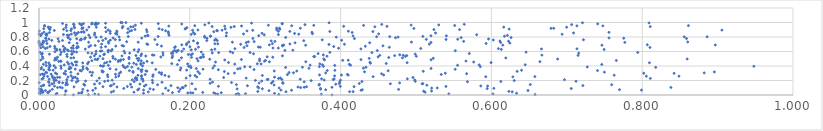
| Category | Series 0 |
|---|---|
| 0.3885912996649001 | 0.001 |
| 0.04568014979297941 | 0.002 |
| 0.034494299770958206 | 0.003 |
| 0.06544103512888798 | 0.004 |
| 0.2654786553118692 | 0.005 |
| 0.6579648299579562 | 0.006 |
| 0.07896282385531533 | 0.007 |
| 0.3179769616430818 | 0.008 |
| 0.2613465137476506 | 0.009 |
| 0.3744980564522131 | 0.01 |
| 0.2370850471365932 | 0.011 |
| 0.022426892672745988 | 0.012 |
| 0.07397478909600808 | 0.013 |
| 0.6021182190554446 | 0.014 |
| 0.1641297389679578 | 0.015 |
| 0.5435866994816935 | 0.016 |
| 0.2341700823863325 | 0.017 |
| 0.27392660834087784 | 0.018 |
| 0.2640816299803176 | 0.019 |
| 0.0017739346704785475 | 0.02 |
| 0.02380295528394952 | 0.021 |
| 0.3122676557970219 | 0.022 |
| 0.13861822031775123 | 0.023 |
| 0.6333729873995015 | 0.024 |
| 0.0002514098818220324 | 0.025 |
| 0.052695726150597866 | 0.026 |
| 0.05630732726060192 | 0.027 |
| 0.19728059959063893 | 0.028 |
| 0.20414104759435728 | 0.029 |
| 0.23182048442203132 | 0.03 |
| 0.20123793832932893 | 0.031 |
| 0.24171609205547587 | 0.032 |
| 0.17698890017039134 | 0.033 |
| 0.012401286446005893 | 0.034 |
| 0.011467405662844408 | 0.035 |
| 0.21714189083534088 | 0.036 |
| 0.005191027334300618 | 0.037 |
| 0.5120981437488354 | 0.038 |
| 0.1259212844313264 | 0.039 |
| 0.09592776339733157 | 0.04 |
| 0.004553401520262339 | 0.041 |
| 0.057130093241079975 | 0.042 |
| 0.14496115079754368 | 0.043 |
| 0.6276078443290874 | 0.044 |
| 0.3275439295590934 | 0.045 |
| 0.41193401992030243 | 0.046 |
| 0.4165989952111739 | 0.047 |
| 0.2901197960842463 | 0.048 |
| 0.18559715029072588 | 0.049 |
| 0.6232082741533077 | 0.05 |
| 0.0353302878521903 | 0.051 |
| 0.09897758554385287 | 0.052 |
| 0.5101873289756991 | 0.053 |
| 0.0014285474286228838 | 0.054 |
| 0.5206367913839332 | 0.055 |
| 0.014404664880159984 | 0.056 |
| 0.004470721066094161 | 0.057 |
| 0.035824480337756176 | 0.058 |
| 0.06453439004023294 | 0.059 |
| 0.305065778458635 | 0.06 |
| 0.008604183297960791 | 0.061 |
| 0.6484953722324461 | 0.062 |
| 0.1715167527006914 | 0.063 |
| 0.07140044032145243 | 0.064 |
| 0.42711439861369127 | 0.065 |
| 0.3349708619145034 | 0.066 |
| 0.3209150994576382 | 0.067 |
| 0.7990488298933376 | 0.068 |
| 0.13870761921371863 | 0.069 |
| 0.13088655079180997 | 0.07 |
| 0.0012999235088806457 | 0.071 |
| 0.38024221136581876 | 0.072 |
| 0.4288439172676947 | 0.073 |
| 0.7699230197191659 | 0.074 |
| 0.0033594454378548366 | 0.075 |
| 0.15178203651823524 | 0.076 |
| 0.4768700541448314 | 0.077 |
| 0.017672932487406805 | 0.078 |
| 0.058137333764332375 | 0.079 |
| 0.3734678123894995 | 0.08 |
| 0.2076077122303574 | 0.081 |
| 0.1875724265588125 | 0.082 |
| 0.0006078466786221371 | 0.083 |
| 0.2627962105567682 | 0.084 |
| 0.13248005451978598 | 0.085 |
| 0.29624278128302123 | 0.086 |
| 0.14722706974224384 | 0.087 |
| 0.5944648775980701 | 0.088 |
| 0.7059220301133016 | 0.089 |
| 0.3732981653292508 | 0.09 |
| 0.11235353247290375 | 0.091 |
| 0.6032580900063622 | 0.092 |
| 0.07495680498773724 | 0.093 |
| 0.16787806620469983 | 0.094 |
| 0.520783441267825 | 0.095 |
| 0.3185444847018437 | 0.096 |
| 0.528096072409565 | 0.097 |
| 0.030882452613538877 | 0.098 |
| 0.2914053303062836 | 0.099 |
| 0.19126918354652095 | 0.1 |
| 0.18402067043175047 | 0.101 |
| 0.34703929501113295 | 0.102 |
| 0.02465598954225511 | 0.103 |
| 0.8380661460960193 | 0.104 |
| 0.1902291067666029 | 0.105 |
| 0.38852711172241805 | 0.106 |
| 0.35182521541817624 | 0.107 |
| 0.028207487390081276 | 0.108 |
| 0.12291809901172476 | 0.109 |
| 0.34349013426027863 | 0.11 |
| 0.10342481818673027 | 0.111 |
| 0.04646018874759079 | 0.112 |
| 0.2899704383524175 | 0.113 |
| 0.35487905517082835 | 0.114 |
| 0.08479813964829824 | 0.115 |
| 0.41785448876608633 | 0.116 |
| 0.11721143696233362 | 0.117 |
| 0.5397137245003522 | 0.118 |
| 0.3996358777890627 | 0.119 |
| 0.2379516751961054 | 0.12 |
| 0.00308977626228721 | 0.121 |
| 0.02049600377338073 | 0.122 |
| 0.1396809860251757 | 0.123 |
| 0.5950203945916888 | 0.124 |
| 0.585942716578019 | 0.125 |
| 0.09470168564365282 | 0.126 |
| 0.19437093689266194 | 0.127 |
| 0.27643988549804843 | 0.128 |
| 0.17505142600982523 | 0.129 |
| 0.7213363098838795 | 0.13 |
| 0.09604123705407903 | 0.131 |
| 0.013820838332696627 | 0.132 |
| 0.005891867967952539 | 0.133 |
| 0.060560303335591266 | 0.134 |
| 0.5144248365494413 | 0.135 |
| 0.006374593408568158 | 0.136 |
| 0.3713650681234426 | 0.137 |
| 0.3117854168376703 | 0.138 |
| 0.14197911968380472 | 0.139 |
| 0.035545411544292645 | 0.14 |
| 0.15729721380635958 | 0.141 |
| 0.7595190600897942 | 0.142 |
| 0.26179520001773005 | 0.143 |
| 0.6515827194563134 | 0.144 |
| 0.03764780287692953 | 0.145 |
| 0.37190408073366826 | 0.146 |
| 0.12136594255863858 | 0.147 |
| 0.05944037081660208 | 0.148 |
| 0.39358120157165477 | 0.149 |
| 0.0736182755934044 | 0.15 |
| 0.1338064330034713 | 0.151 |
| 0.09921700710868962 | 0.152 |
| 0.016956075520488192 | 0.153 |
| 0.5080924835409575 | 0.154 |
| 0.46601100093755826 | 0.155 |
| 0.20286933436972943 | 0.156 |
| 0.5090202410279231 | 0.157 |
| 0.39824147414739597 | 0.158 |
| 0.42477980340689286 | 0.159 |
| 0.0805121218451937 | 0.16 |
| 0.3236380111163928 | 0.161 |
| 0.2270176087761528 | 0.162 |
| 0.019719929352465485 | 0.163 |
| 0.3082311261249649 | 0.164 |
| 0.2919192306856668 | 0.165 |
| 0.036050672014934934 | 0.166 |
| 0.47827103358063455 | 0.167 |
| 0.03142007696086621 | 0.168 |
| 0.00028191388817377526 | 0.169 |
| 0.1507608366884793 | 0.17 |
| 0.3232998310308184 | 0.171 |
| 0.2553352401378081 | 0.172 |
| 0.0265876233167394 | 0.173 |
| 0.013232400282367428 | 0.174 |
| 0.036697861553024166 | 0.175 |
| 0.16312645414156773 | 0.176 |
| 0.049574751698721 | 0.177 |
| 0.2302140192940377 | 0.178 |
| 0.02668153254664522 | 0.179 |
| 0.39894582883489305 | 0.18 |
| 0.3516559865881537 | 0.181 |
| 0.012740068007257641 | 0.182 |
| 0.568246596947958 | 0.183 |
| 0.1262459035508711 | 0.184 |
| 0.42833304108615516 | 0.185 |
| 0.3102997327899937 | 0.186 |
| 0.6125192869050767 | 0.187 |
| 0.08710498839041589 | 0.188 |
| 0.4990378330157604 | 0.189 |
| 0.7122505064040833 | 0.19 |
| 0.13804207992879483 | 0.191 |
| 0.2953765263873386 | 0.192 |
| 0.061789444526040904 | 0.193 |
| 0.07681258852855559 | 0.194 |
| 0.05177388638057489 | 0.195 |
| 0.09155852131965314 | 0.196 |
| 0.02052476989827676 | 0.197 |
| 0.360997141523083 | 0.198 |
| 0.6302849883997981 | 0.199 |
| 0.04363301822215 | 0.2 |
| 0.2870283869322517 | 0.201 |
| 0.02278985866011461 | 0.202 |
| 0.15035704689331597 | 0.203 |
| 0.09704116014347929 | 0.204 |
| 0.3998512359681855 | 0.205 |
| 0.37819548515209367 | 0.206 |
| 0.12963729565883234 | 0.207 |
| 0.49829902700020823 | 0.208 |
| 0.12374583365249965 | 0.209 |
| 0.02008043431412441 | 0.21 |
| 0.6969174031649984 | 0.211 |
| 0.0369600631662298 | 0.212 |
| 0.39018001947817127 | 0.213 |
| 0.3026653005085462 | 0.214 |
| 0.32214488325071927 | 0.215 |
| 0.3037720716064263 | 0.216 |
| 0.2269457350023957 | 0.217 |
| 0.34651533735007717 | 0.218 |
| 0.013489662404278914 | 0.219 |
| 0.13763171351399187 | 0.22 |
| 0.003907584485617166 | 0.221 |
| 0.39150489983918524 | 0.222 |
| 0.48852264103388926 | 0.223 |
| 0.374786110961824 | 0.224 |
| 0.13614588688669052 | 0.225 |
| 0.0508623704487016 | 0.226 |
| 0.12766129985164493 | 0.227 |
| 0.3176957149109014 | 0.228 |
| 0.8107910100490998 | 0.229 |
| 0.1295852172154426 | 0.23 |
| 0.0056753192156077225 | 0.231 |
| 0.07992492856046232 | 0.232 |
| 0.2747645012385094 | 0.233 |
| 0.195174522464103 | 0.234 |
| 0.32014496563452366 | 0.235 |
| 0.04463752139668267 | 0.236 |
| 0.018226161429361933 | 0.237 |
| 0.020989909601775793 | 0.238 |
| 0.0455464388368831 | 0.239 |
| 0.12817102728992638 | 0.24 |
| 0.2449057687375314 | 0.241 |
| 0.4959312859390136 | 0.242 |
| 0.024540046183103542 | 0.243 |
| 0.02746495974854569 | 0.244 |
| 0.048039951427388684 | 0.245 |
| 0.31235577138460274 | 0.246 |
| 0.10194257612933474 | 0.247 |
| 0.03846873777471701 | 0.248 |
| 0.20928086463048234 | 0.249 |
| 0.6284656254894138 | 0.25 |
| 0.0913131641335622 | 0.251 |
| 0.5924975778154639 | 0.252 |
| 0.4431268978691014 | 0.253 |
| 0.6576446554462669 | 0.254 |
| 0.17221250104258612 | 0.255 |
| 0.011393780079119654 | 0.256 |
| 0.13577117618054882 | 0.257 |
| 0.15086656701502776 | 0.258 |
| 0.8055079664046778 | 0.259 |
| 0.8487749090843818 | 0.26 |
| 0.01757323026442816 | 0.261 |
| 0.1057299930643401 | 0.262 |
| 0.006584077491047116 | 0.263 |
| 0.39202317547297655 | 0.264 |
| 0.04260503704641708 | 0.265 |
| 0.13608285744387583 | 0.266 |
| 0.2004113072685703 | 0.267 |
| 0.20688657305403957 | 0.268 |
| 0.29624637759529254 | 0.269 |
| 0.06988626952477985 | 0.27 |
| 0.16700690561201487 | 0.271 |
| 0.13118893005248186 | 0.272 |
| 0.7628031944075714 | 0.273 |
| 0.4100783531474689 | 0.274 |
| 0.4011439698851054 | 0.275 |
| 0.4571494244125698 | 0.276 |
| 0.3720671485604954 | 0.277 |
| 0.1514011675126413 | 0.278 |
| 0.09082214961860398 | 0.279 |
| 0.0015720967298583296 | 0.28 |
| 0.32946180837993344 | 0.281 |
| 0.14082973306280605 | 0.282 |
| 0.5335466242137192 | 0.283 |
| 0.4090032930693339 | 0.284 |
| 0.1624993455021091 | 0.285 |
| 0.10141694716566163 | 0.286 |
| 0.03514885405755301 | 0.287 |
| 0.015970866267764817 | 0.288 |
| 0.0044985529544451655 | 0.289 |
| 0.007117227686521675 | 0.29 |
| 0.023587554571029214 | 0.291 |
| 0.05162032037605449 | 0.292 |
| 0.4543978065525077 | 0.293 |
| 0.5671095659496487 | 0.294 |
| 0.2508614971978673 | 0.295 |
| 0.21296217974675777 | 0.296 |
| 0.10646406449087562 | 0.297 |
| 0.033052033297505494 | 0.298 |
| 0.8422964279729546 | 0.299 |
| 0.8020525991956174 | 0.3 |
| 0.5388814054509062 | 0.301 |
| 0.2592367683519 | 0.302 |
| 0.0216738328429713 | 0.303 |
| 0.38024413171806465 | 0.304 |
| 0.8822576148295285 | 0.305 |
| 0.16244219283494377 | 0.306 |
| 0.3375689715698566 | 0.307 |
| 0.01020960979553166 | 0.308 |
| 0.3316871897525667 | 0.309 |
| 0.15949209538066553 | 0.31 |
| 0.07107945186833563 | 0.311 |
| 0.1248585686324479 | 0.312 |
| 0.042224440907629654 | 0.313 |
| 0.009442095499924776 | 0.314 |
| 0.7498568702172727 | 0.315 |
| 0.10840845624625103 | 0.316 |
| 0.06763765874553339 | 0.317 |
| 0.8957407431811881 | 0.318 |
| 0.08380068208150757 | 0.319 |
| 0.4317455831665539 | 0.32 |
| 0.08524219846764675 | 0.321 |
| 0.1359459442498123 | 0.322 |
| 0.21074340215099735 | 0.323 |
| 0.24583147862770802 | 0.324 |
| 0.12459731860575618 | 0.325 |
| 0.6341693514737757 | 0.326 |
| 0.5096147812906316 | 0.327 |
| 0.14305003558410753 | 0.328 |
| 0.0352232958072641 | 0.329 |
| 0.3419173941414241 | 0.33 |
| 0.31204150090087246 | 0.331 |
| 0.05624094175732168 | 0.332 |
| 0.14185310693326614 | 0.333 |
| 0.46302218016301766 | 0.334 |
| 0.08362633765572254 | 0.335 |
| 0.11993169820773697 | 0.336 |
| 0.7407427116450136 | 0.337 |
| 0.38237957143544987 | 0.338 |
| 0.05448463952776728 | 0.339 |
| 0.39239871268989573 | 0.34 |
| 0.6400181531447775 | 0.341 |
| 0.01878306758363775 | 0.342 |
| 0.19580946853143963 | 0.343 |
| 0.1351358475862227 | 0.344 |
| 0.006422367615585898 | 0.345 |
| 0.18736254971635033 | 0.346 |
| 0.014084876165252745 | 0.347 |
| 0.1367581170899524 | 0.348 |
| 0.237941122347981 | 0.349 |
| 0.012914740885646862 | 0.35 |
| 0.28521171562701897 | 0.351 |
| 0.10229029789203503 | 0.352 |
| 0.1548255651005293 | 0.353 |
| 0.06449486721398422 | 0.354 |
| 0.5519514543250997 | 0.355 |
| 0.2175033133910074 | 0.356 |
| 0.04806964694480033 | 0.357 |
| 0.0026015233157297107 | 0.358 |
| 0.05842580419396207 | 0.359 |
| 0.26367019013928006 | 0.36 |
| 0.0407024596350441 | 0.361 |
| 0.03967015607757684 | 0.362 |
| 0.09416842037875034 | 0.363 |
| 0.13161968944797472 | 0.364 |
| 0.20860885941948626 | 0.365 |
| 0.5199775700548291 | 0.366 |
| 0.26671610192374795 | 0.367 |
| 0.029342978052359497 | 0.368 |
| 0.35804116437002703 | 0.369 |
| 0.43022459824482195 | 0.37 |
| 0.06328399910217022 | 0.371 |
| 0.2305855806718841 | 0.372 |
| 0.042417718315618524 | 0.373 |
| 0.18814132374554157 | 0.374 |
| 0.11458980870815903 | 0.375 |
| 0.021932869625320307 | 0.376 |
| 0.2016077194213552 | 0.377 |
| 0.003486793354893564 | 0.378 |
| 0.013335229731952399 | 0.379 |
| 0.3270552398913902 | 0.38 |
| 0.8178900254290823 | 0.381 |
| 0.43361707971990576 | 0.382 |
| 0.3493720656251905 | 0.383 |
| 0.12311486103286177 | 0.384 |
| 0.11261421485447037 | 0.385 |
| 0.040914575586492856 | 0.386 |
| 0.7271732453935685 | 0.387 |
| 0.2799964752605413 | 0.388 |
| 0.2727835630251524 | 0.389 |
| 0.05832137093897253 | 0.39 |
| 0.5853279101660013 | 0.391 |
| 0.3718904849575231 | 0.392 |
| 0.11747577380634014 | 0.393 |
| 0.3772033185338375 | 0.394 |
| 0.19842904746393591 | 0.395 |
| 0.9481048759106425 | 0.396 |
| 0.20074679840300685 | 0.397 |
| 0.08393615018036618 | 0.398 |
| 0.028964916769307476 | 0.399 |
| 0.08552771695585397 | 0.4 |
| 0.13727429029936233 | 0.401 |
| 0.23266850555521573 | 0.402 |
| 0.01473027313287642 | 0.403 |
| 0.08147651478111144 | 0.404 |
| 0.019924859588376365 | 0.405 |
| 0.009494203618886912 | 0.406 |
| 0.11125640035174314 | 0.407 |
| 0.3922450217457155 | 0.408 |
| 0.0919608493365012 | 0.409 |
| 0.5551666138956836 | 0.41 |
| 0.4131931364820714 | 0.411 |
| 0.3595721865635765 | 0.412 |
| 0.049527551042288134 | 0.413 |
| 0.04498291828352519 | 0.414 |
| 0.033451588204249316 | 0.415 |
| 0.5837472487193254 | 0.416 |
| 0.6447834176101817 | 0.417 |
| 0.3759728184585852 | 0.418 |
| 0.014201523486452688 | 0.419 |
| 0.18357915468284436 | 0.42 |
| 0.7463738807948967 | 0.421 |
| 0.1290653816136783 | 0.422 |
| 0.41158597722600343 | 0.423 |
| 0.005779513357900551 | 0.424 |
| 0.13495873062394062 | 0.425 |
| 0.2595942801356165 | 0.426 |
| 0.039256359189882926 | 0.427 |
| 0.29453165626643035 | 0.428 |
| 0.19711411075579494 | 0.429 |
| 0.37252732818612344 | 0.43 |
| 0.2895420590727385 | 0.431 |
| 0.06444246579140496 | 0.432 |
| 0.17610341557820505 | 0.433 |
| 0.13520493183631135 | 0.434 |
| 0.460520304296559 | 0.435 |
| 0.11968847104405499 | 0.436 |
| 0.43960112049682915 | 0.437 |
| 0.043303807647355884 | 0.438 |
| 0.12566355477499644 | 0.439 |
| 0.0870142595594529 | 0.44 |
| 0.13875469060334492 | 0.441 |
| 0.01296089778299604 | 0.442 |
| 0.058023127191111086 | 0.443 |
| 0.15015924615685874 | 0.444 |
| 0.8095879380036638 | 0.445 |
| 0.48825552086885926 | 0.446 |
| 0.599550885111572 | 0.447 |
| 0.25138228963772535 | 0.448 |
| 0.009112753191045472 | 0.449 |
| 0.08978480752691868 | 0.45 |
| 0.03772517974096289 | 0.451 |
| 0.4389113534935962 | 0.452 |
| 0.06569578404681879 | 0.453 |
| 0.2340750522577499 | 0.454 |
| 0.5765118595362151 | 0.455 |
| 0.05037543133996635 | 0.456 |
| 0.048227371432360645 | 0.457 |
| 0.3055638619422562 | 0.458 |
| 0.35384187563365405 | 0.459 |
| 0.6643062773883999 | 0.46 |
| 0.09403824756038703 | 0.461 |
| 0.10516752085346302 | 0.462 |
| 0.02621001135285664 | 0.463 |
| 0.14331673829960276 | 0.464 |
| 0.028733991841729162 | 0.465 |
| 0.2990401426954556 | 0.466 |
| 0.029135384241578768 | 0.467 |
| 0.5662303357521106 | 0.468 |
| 0.10778240675875117 | 0.469 |
| 0.2109713625239329 | 0.47 |
| 0.29252945847163947 | 0.471 |
| 0.1355145435040712 | 0.472 |
| 0.07009802026840245 | 0.473 |
| 0.13181859663351203 | 0.474 |
| 0.10541314652982578 | 0.475 |
| 0.7657096197194447 | 0.476 |
| 0.30044071227478736 | 0.477 |
| 0.40283595998986194 | 0.478 |
| 0.18587490342101298 | 0.479 |
| 0.4100717948611326 | 0.48 |
| 0.020804762733771003 | 0.481 |
| 0.0022989487506168546 | 0.482 |
| 0.24637387364645888 | 0.483 |
| 0.37859627577052957 | 0.484 |
| 0.10839681947221562 | 0.485 |
| 0.5200406839354654 | 0.486 |
| 0.0771903556444767 | 0.487 |
| 0.4270596111980621 | 0.488 |
| 0.2684881849784473 | 0.489 |
| 0.11193046640662158 | 0.49 |
| 0.023440783407494403 | 0.491 |
| 0.07447010040655863 | 0.492 |
| 0.2264059154915284 | 0.493 |
| 0.10131366176197613 | 0.494 |
| 0.29254110891311125 | 0.495 |
| 0.6878354588549372 | 0.496 |
| 0.8596649290177997 | 0.497 |
| 0.37771137397336585 | 0.498 |
| 0.07826276840821948 | 0.499 |
| 0.11936878339891904 | 0.5 |
| 0.08481693446491304 | 0.501 |
| 0.20946424676610292 | 0.502 |
| 0.13239124715535588 | 0.503 |
| 0.13028388195953078 | 0.504 |
| 0.4379925959411104 | 0.505 |
| 0.0051220912252720255 | 0.506 |
| 0.5229311395780788 | 0.507 |
| 0.021575930634258212 | 0.508 |
| 0.09821920950195485 | 0.509 |
| 0.04238055298214177 | 0.51 |
| 0.6191102534837316 | 0.511 |
| 0.4819821288821126 | 0.512 |
| 0.1889573842884714 | 0.513 |
| 0.045981360457881267 | 0.514 |
| 0.17651049080353 | 0.515 |
| 0.21387678160190887 | 0.516 |
| 0.4639016885704844 | 0.517 |
| 0.21520766034354336 | 0.518 |
| 0.20231059801481324 | 0.519 |
| 0.1194178440137192 | 0.52 |
| 0.31005638447489076 | 0.521 |
| 0.06836670738995652 | 0.522 |
| 0.02455014420385129 | 0.523 |
| 0.1615916971536765 | 0.524 |
| 0.21814976951151796 | 0.525 |
| 0.4497597726969386 | 0.526 |
| 0.30266076902963285 | 0.527 |
| 0.004538049314919775 | 0.528 |
| 0.03738924252603319 | 0.529 |
| 0.3643135155916345 | 0.53 |
| 0.36558787521314146 | 0.531 |
| 0.09787548173058339 | 0.532 |
| 0.48596473639701715 | 0.533 |
| 0.500381378665156 | 0.534 |
| 0.38189143225881594 | 0.535 |
| 0.08092470498583641 | 0.536 |
| 0.17718586812987328 | 0.537 |
| 0.14155769761035128 | 0.538 |
| 0.11008161587763085 | 0.539 |
| 0.322926495332179 | 0.54 |
| 0.07344484299631501 | 0.541 |
| 0.13517616164744972 | 0.542 |
| 0.4716623157488677 | 0.543 |
| 0.48771928194837894 | 0.544 |
| 0.12856982032959066 | 0.545 |
| 0.7149865140211222 | 0.546 |
| 0.45192897995996567 | 0.547 |
| 0.48304123388472053 | 0.548 |
| 0.15254756247648205 | 0.549 |
| 0.6669699348741115 | 0.55 |
| 0.16452075096172636 | 0.551 |
| 0.15036477453362587 | 0.552 |
| 0.37706429795846014 | 0.553 |
| 0.20168118409830907 | 0.554 |
| 0.47846201123335225 | 0.555 |
| 0.2176530333146807 | 0.556 |
| 0.08595677680933056 | 0.557 |
| 0.02841364307822414 | 0.558 |
| 0.19807896269022798 | 0.559 |
| 0.0370469676141052 | 0.56 |
| 0.04331251408329776 | 0.561 |
| 0.003345629379852088 | 0.562 |
| 0.01390978505446986 | 0.563 |
| 0.4989712885556425 | 0.564 |
| 0.08676304282177556 | 0.565 |
| 0.13611297958966057 | 0.566 |
| 0.2034430000445708 | 0.567 |
| 0.28447123135581365 | 0.568 |
| 0.07534363286513182 | 0.569 |
| 0.044079711374354555 | 0.57 |
| 0.37014246253615907 | 0.571 |
| 0.5707248675583312 | 0.572 |
| 0.0045004996063331805 | 0.573 |
| 0.17736036018605558 | 0.574 |
| 0.1755485775167412 | 0.575 |
| 0.07009207975769995 | 0.576 |
| 0.12021619820223718 | 0.577 |
| 0.7158909763055676 | 0.578 |
| 0.11388142055392572 | 0.579 |
| 0.2298148103918396 | 0.58 |
| 0.06499235124580781 | 0.581 |
| 0.2569665663386745 | 0.582 |
| 0.1643548892561834 | 0.583 |
| 0.23830616289461098 | 0.584 |
| 0.4415236108446895 | 0.585 |
| 0.2799331073253092 | 0.586 |
| 0.7940849041496809 | 0.587 |
| 0.38580701451591604 | 0.588 |
| 0.0012555411009192174 | 0.589 |
| 0.029433258612035117 | 0.59 |
| 0.6459617196994217 | 0.591 |
| 0.049878123245416746 | 0.592 |
| 0.21529793520390364 | 0.593 |
| 0.0917887885100757 | 0.594 |
| 0.182414032201401 | 0.595 |
| 0.13121465807260882 | 0.596 |
| 0.021198148380765416 | 0.597 |
| 0.2536581584538812 | 0.598 |
| 0.046319977631126164 | 0.599 |
| 0.1779760447424858 | 0.6 |
| 0.03342178929263945 | 0.601 |
| 0.18945849242396126 | 0.602 |
| 0.07578328603584944 | 0.603 |
| 0.043121559581397566 | 0.604 |
| 0.11270613196680833 | 0.605 |
| 0.08146253514384957 | 0.606 |
| 0.08349035862339366 | 0.607 |
| 0.18286640504148297 | 0.608 |
| 0.09583207853827741 | 0.609 |
| 0.03906800323496387 | 0.61 |
| 0.5521172706629827 | 0.611 |
| 0.0915804133906852 | 0.612 |
| 0.4486397785889366 | 0.613 |
| 0.17980116780005656 | 0.614 |
| 0.3261445019643273 | 0.615 |
| 0.18468120107420102 | 0.616 |
| 0.09219904759971861 | 0.617 |
| 0.33666844932915035 | 0.618 |
| 0.03298172222708021 | 0.619 |
| 0.023594387549979022 | 0.62 |
| 0.037804561307806794 | 0.621 |
| 0.2288833841484382 | 0.622 |
| 0.20191630004794794 | 0.623 |
| 0.12635372713840945 | 0.624 |
| 0.027751761147106674 | 0.625 |
| 0.13242476729909486 | 0.626 |
| 0.09704656507416184 | 0.627 |
| 0.7495355842004544 | 0.628 |
| 0.613237570154329 | 0.629 |
| 0.20761047079682923 | 0.63 |
| 0.023338616543740583 | 0.631 |
| 0.23324654417763588 | 0.632 |
| 0.06138969370838313 | 0.633 |
| 0.19197351344378905 | 0.634 |
| 0.6663864480332331 | 0.635 |
| 0.426910015141613 | 0.636 |
| 0.7134954596984838 | 0.637 |
| 0.03410744382553303 | 0.638 |
| 0.2597920121143072 | 0.639 |
| 0.6092945562654781 | 0.64 |
| 0.008480049936208883 | 0.641 |
| 0.5062744607707753 | 0.642 |
| 0.045285274765532645 | 0.643 |
| 0.02115555021353207 | 0.644 |
| 0.3973213113126393 | 0.645 |
| 0.03453448053156674 | 0.646 |
| 0.31737204141019687 | 0.647 |
| 0.310347289205983 | 0.648 |
| 0.050042725400108554 | 0.649 |
| 0.043015602641803194 | 0.65 |
| 0.010900519518858438 | 0.651 |
| 0.00235437923351028 | 0.652 |
| 0.17979819748114345 | 0.653 |
| 0.05041138892738015 | 0.654 |
| 0.27202323912849724 | 0.655 |
| 0.810297614760865 | 0.656 |
| 0.08238165851528809 | 0.657 |
| 0.4646491367385085 | 0.658 |
| 0.29347541778467157 | 0.659 |
| 0.21148250021262024 | 0.66 |
| 0.05205425985272268 | 0.661 |
| 0.2909589866404979 | 0.662 |
| 0.005695235623411506 | 0.663 |
| 0.06617939115077572 | 0.664 |
| 0.20019275522687244 | 0.665 |
| 0.18083443204625926 | 0.666 |
| 0.08828711182445519 | 0.667 |
| 0.3909124887862879 | 0.668 |
| 0.05107028429037609 | 0.669 |
| 0.014534868018224793 | 0.67 |
| 0.020752464499415937 | 0.671 |
| 0.43284565238959843 | 0.672 |
| 0.032057622970495296 | 0.673 |
| 0.10182725343558177 | 0.674 |
| 0.16239855274863005 | 0.675 |
| 0.11205474751007982 | 0.676 |
| 0.32292721280466136 | 0.677 |
| 0.45620638242901573 | 0.678 |
| 0.27584944158394276 | 0.679 |
| 0.04550527635819238 | 0.68 |
| 0.11020512497750559 | 0.681 |
| 0.06853511507256842 | 0.682 |
| 0.0745098310776339 | 0.683 |
| 0.0006530020471492204 | 0.684 |
| 0.3230106882853846 | 0.685 |
| 0.35363919062059584 | 0.686 |
| 0.7465831604498189 | 0.687 |
| 0.6150734370090561 | 0.688 |
| 0.32467026138458843 | 0.689 |
| 0.8969196674942176 | 0.69 |
| 0.30552775139445504 | 0.691 |
| 0.18940111422552913 | 0.692 |
| 0.8068336355959342 | 0.693 |
| 0.1955849374209544 | 0.694 |
| 0.0036313115102657952 | 0.695 |
| 0.15683747100043174 | 0.696 |
| 0.3845467584452786 | 0.697 |
| 0.14421032964243694 | 0.698 |
| 0.2674949520868335 | 0.699 |
| 0.40504984429481006 | 0.7 |
| 0.5176434775106658 | 0.701 |
| 0.08304106700157791 | 0.702 |
| 0.0038306252514591823 | 0.703 |
| 0.3327667636733574 | 0.704 |
| 0.1429929414876548 | 0.705 |
| 0.23718814328717283 | 0.706 |
| 0.23326348576229086 | 0.707 |
| 0.3095433275190253 | 0.708 |
| 0.19590247413892448 | 0.709 |
| 0.010587631211297134 | 0.71 |
| 0.5929959714972954 | 0.711 |
| 0.2101925108491979 | 0.712 |
| 0.0003414227438518891 | 0.713 |
| 0.0505179780065083 | 0.714 |
| 0.09240865914812543 | 0.715 |
| 0.6244970355107214 | 0.716 |
| 0.005353802457054765 | 0.717 |
| 0.21055720944670975 | 0.718 |
| 8.374840601944557e-05 | 0.719 |
| 0.3395917422401335 | 0.72 |
| 0.43854722267518803 | 0.721 |
| 0.04011275411256677 | 0.722 |
| 0.2748628266089156 | 0.723 |
| 0.6122412748382432 | 0.724 |
| 0.5198539651175794 | 0.725 |
| 0.7769451172296872 | 0.726 |
| 0.06584996285570599 | 0.727 |
| 0.13156974542421707 | 0.728 |
| 0.25652778449918456 | 0.729 |
| 0.4939485609831108 | 0.73 |
| 0.1985794682966306 | 0.731 |
| 0.8603387309716838 | 0.732 |
| 0.27768635306638717 | 0.733 |
| 0.006348584687715956 | 0.734 |
| 0.11631148372167747 | 0.735 |
| 0.09204635548514992 | 0.736 |
| 0.2853049332427844 | 0.737 |
| 0.026362727591249663 | 0.738 |
| 0.31289524280919556 | 0.739 |
| 0.563174008441367 | 0.74 |
| 4.3276539488525187e-05 | 0.741 |
| 0.6227358058110365 | 0.742 |
| 0.07891248508977755 | 0.743 |
| 0.005576327319239412 | 0.744 |
| 0.6112904765960501 | 0.745 |
| 0.30796304848593853 | 0.746 |
| 0.20484205977777292 | 0.747 |
| 0.00976626516476696 | 0.748 |
| 0.35117976498834025 | 0.749 |
| 0.22252311202736608 | 0.75 |
| 0.236485890355176 | 0.751 |
| 0.031154425547004 | 0.752 |
| 0.08461844212514162 | 0.753 |
| 0.016911917642435815 | 0.754 |
| 0.40140772135296177 | 0.755 |
| 0.23296520215865837 | 0.756 |
| 0.0946475047593216 | 0.757 |
| 0.05448146853635076 | 0.758 |
| 0.6025295881357926 | 0.759 |
| 0.10699328043041675 | 0.76 |
| 0.37560452738530037 | 0.761 |
| 0.7220986048962225 | 0.762 |
| 0.056151084583069784 | 0.763 |
| 0.10117958204421967 | 0.764 |
| 0.15367372316923278 | 0.765 |
| 0.539837543756785 | 0.766 |
| 0.5136503354974921 | 0.767 |
| 0.04153190695836177 | 0.768 |
| 0.5553232902624885 | 0.769 |
| 0.23448283043645576 | 0.77 |
| 0.013196454734441136 | 0.771 |
| 0.055970378463201166 | 0.772 |
| 0.5962269525506357 | 0.773 |
| 0.06042103844020448 | 0.774 |
| 0.02527886319221811 | 0.775 |
| 0.04996823317216191 | 0.776 |
| 0.08845944965857541 | 0.777 |
| 0.41834147625716267 | 0.778 |
| 0.858769309094504 | 0.779 |
| 0.2836710712964586 | 0.78 |
| 0.00905144783551677 | 0.781 |
| 0.22282534288403782 | 0.782 |
| 0.775494689799456 | 0.783 |
| 0.008983174148422842 | 0.784 |
| 0.13625419735487893 | 0.785 |
| 0.0982494760791609 | 0.786 |
| 0.755950559883346 | 0.787 |
| 0.03860104958030734 | 0.788 |
| 0.06147019839897692 | 0.789 |
| 0.4729274417334741 | 0.79 |
| 0.5599140243394738 | 0.791 |
| 0.06768604326230272 | 0.792 |
| 0.6260507256094153 | 0.793 |
| 0.3271903207710858 | 0.794 |
| 0.038743725070645024 | 0.795 |
| 0.07571121626667114 | 0.796 |
| 0.21984466660345756 | 0.797 |
| 0.3942544018884787 | 0.798 |
| 0.47625571304474684 | 0.799 |
| 0.08244064852378553 | 0.8 |
| 0.10626816812919243 | 0.801 |
| 0.8557678627331482 | 0.802 |
| 0.8860834231832683 | 0.803 |
| 0.44780292344583045 | 0.804 |
| 0.46517738681753884 | 0.805 |
| 0.11837462773387826 | 0.806 |
| 0.15807898214455496 | 0.807 |
| 0.5091133926951646 | 0.808 |
| 0.22731255124403346 | 0.809 |
| 0.21963546357855038 | 0.81 |
| 0.6173269993728495 | 0.811 |
| 0.14072990131684 | 0.812 |
| 0.2276566922286564 | 0.813 |
| 0.24828746532500195 | 0.814 |
| 0.4165116907297917 | 0.815 |
| 0.5403366537864268 | 0.816 |
| 0.5198231654887022 | 0.817 |
| 0.29140042169177893 | 0.818 |
| 0.14458771631621953 | 0.819 |
| 0.0023104075787062006 | 0.82 |
| 0.14376749357844723 | 0.821 |
| 0.6212997973837727 | 0.822 |
| 0.010306047484776388 | 0.823 |
| 0.17243493536093216 | 0.824 |
| 0.03741929771491683 | 0.825 |
| 0.06601533987283807 | 0.826 |
| 0.03987256564883735 | 0.827 |
| 0.048615884533932854 | 0.828 |
| 0.07365541338544068 | 0.829 |
| 0.29878454654910075 | 0.83 |
| 0.000748981921400232 | 0.831 |
| 0.5804542072471918 | 0.832 |
| 0.3174959251590536 | 0.833 |
| 0.03244302628098091 | 0.834 |
| 0.008912773003791652 | 0.835 |
| 0.2019362913898463 | 0.836 |
| 0.10338102095808503 | 0.837 |
| 0.6937899482843783 | 0.838 |
| 0.3445783736945512 | 0.839 |
| 0.04297681345642036 | 0.84 |
| 0.20666947565783858 | 0.841 |
| 0.27127161687891327 | 0.842 |
| 0.45048295313735975 | 0.843 |
| 0.01058915692949337 | 0.844 |
| 0.00027149157744222707 | 0.845 |
| 0.36268829664334545 | 0.846 |
| 0.0040874150297501655 | 0.847 |
| 0.10150841482357101 | 0.848 |
| 0.338986836923897 | 0.849 |
| 0.09448399763811721 | 0.85 |
| 0.2958167586069914 | 0.851 |
| 0.05074662202013597 | 0.852 |
| 0.17169810736022015 | 0.853 |
| 0.07386499376534646 | 0.854 |
| 0.5258409575299399 | 0.855 |
| 0.7089145370130964 | 0.856 |
| 0.24870681438985143 | 0.857 |
| 0.04707358701412176 | 0.858 |
| 0.11754871498201154 | 0.859 |
| 0.20488204544028232 | 0.86 |
| 0.013837414437533339 | 0.861 |
| 0.41530893304441757 | 0.862 |
| 0.052247579944080184 | 0.863 |
| 0.7559569407829057 | 0.864 |
| 0.36196986854358815 | 0.865 |
| 0.05969953867798388 | 0.866 |
| 0.006662367596742296 | 0.867 |
| 0.05603398653497839 | 0.868 |
| 0.10338059926939563 | 0.869 |
| 0.14337189855745466 | 0.87 |
| 0.17148307371837157 | 0.871 |
| 0.08892663039998135 | 0.872 |
| 0.2318018974260959 | 0.873 |
| 0.05905479405898421 | 0.874 |
| 0.4428523355212093 | 0.875 |
| 0.38572863508862787 | 0.876 |
| 0.3326547883847751 | 0.877 |
| 0.3174774942898962 | 0.878 |
| 0.0943952642091845 | 0.879 |
| 0.41032859616865663 | 0.88 |
| 0.12037142828317743 | 0.881 |
| 0.10323268465546782 | 0.882 |
| 0.0003471459541098327 | 0.883 |
| 0.27584464687023896 | 0.884 |
| 0.2365746783322969 | 0.885 |
| 0.16791808834110974 | 0.886 |
| 0.036929204209073696 | 0.887 |
| 0.04218461256252901 | 0.888 |
| 0.1228092205349498 | 0.889 |
| 0.020356774602096755 | 0.89 |
| 0.23574167633915855 | 0.891 |
| 0.2834902333231052 | 0.892 |
| 0.20367508801632633 | 0.893 |
| 0.24288141881116035 | 0.894 |
| 0.9056947709944955 | 0.895 |
| 0.06343636319422838 | 0.896 |
| 0.2107385303277075 | 0.897 |
| 0.09169923481460981 | 0.898 |
| 0.31528574027005396 | 0.899 |
| 0.14265035177726554 | 0.9 |
| 0.16343719117459035 | 0.901 |
| 0.5577440399594343 | 0.902 |
| 0.523746046557794 | 0.903 |
| 0.1272963451911788 | 0.904 |
| 0.014351931777317126 | 0.905 |
| 0.03259527857551598 | 0.906 |
| 0.319468821608078 | 0.907 |
| 0.014346255050709078 | 0.908 |
| 0.6235756574732152 | 0.909 |
| 0.19373678191233315 | 0.91 |
| 0.2469910710191827 | 0.911 |
| 0.043074428671850185 | 0.912 |
| 0.11812080991222539 | 0.913 |
| 0.1592670282413152 | 0.914 |
| 0.006286328827112399 | 0.915 |
| 0.05693201011088964 | 0.916 |
| 0.1944542605739695 | 0.917 |
| 0.4971785715141836 | 0.918 |
| 0.6790516131786064 | 0.919 |
| 0.682644977616256 | 0.92 |
| 0.3466355507764349 | 0.921 |
| 0.3189053520664269 | 0.922 |
| 0.31512351807333827 | 0.923 |
| 0.05756410012485564 | 0.924 |
| 0.05849320078421802 | 0.925 |
| 0.012893366489830721 | 0.926 |
| 0.04729191683562241 | 0.927 |
| 0.11054255952130757 | 0.928 |
| 0.19607921754321062 | 0.929 |
| 0.08820378828051285 | 0.93 |
| 0.03568596994685761 | 0.931 |
| 0.0150939257334934 | 0.932 |
| 0.2545398446691343 | 0.933 |
| 0.0760153514108388 | 0.934 |
| 0.6997747956111783 | 0.935 |
| 0.6163735151121805 | 0.936 |
| 0.06616934516183114 | 0.937 |
| 0.04653322289605373 | 0.938 |
| 0.012238685891497176 | 0.939 |
| 0.12156677133542614 | 0.94 |
| 0.44543245221112376 | 0.941 |
| 0.12495103945658055 | 0.942 |
| 0.8107166220483673 | 0.943 |
| 0.229576972159057 | 0.944 |
| 0.25891764058531264 | 0.945 |
| 0.11123169060248195 | 0.946 |
| 0.461491359012702 | 0.947 |
| 0.404062780196546 | 0.948 |
| 0.24630085046195122 | 0.949 |
| 0.17212095888065962 | 0.95 |
| 0.0073565609028801255 | 0.951 |
| 0.26862751256811673 | 0.952 |
| 0.7478255549773788 | 0.953 |
| 0.7134318794586264 | 0.954 |
| 0.33511198697708444 | 0.955 |
| 0.2065833879988661 | 0.956 |
| 0.8613041798701597 | 0.957 |
| 0.007373707697083952 | 0.958 |
| 0.5512691264108625 | 0.959 |
| 0.43044971831909185 | 0.96 |
| 0.36443212722636276 | 0.961 |
| 0.30423297884910455 | 0.962 |
| 0.12788744037617758 | 0.963 |
| 0.4935349179409141 | 0.964 |
| 0.036217844925120805 | 0.965 |
| 0.05608253431157267 | 0.966 |
| 0.5301676226162868 | 0.967 |
| 0.21993146102087432 | 0.968 |
| 0.046541422809248424 | 0.969 |
| 0.35272286310722206 | 0.97 |
| 0.7064121263798557 | 0.971 |
| 0.07535239146575182 | 0.972 |
| 0.05681745336631774 | 0.973 |
| 0.45456107170980725 | 0.974 |
| 0.5639651445458651 | 0.975 |
| 0.07651521597907787 | 0.976 |
| 0.07397983242768853 | 0.977 |
| 0.045801734284518045 | 0.978 |
| 0.0698026192710814 | 0.979 |
| 0.1892989993190194 | 0.98 |
| 0.7409978990518891 | 0.981 |
| 0.3227404371793329 | 0.982 |
| 0.053916715002035945 | 0.983 |
| 0.05891280113909358 | 0.984 |
| 0.15815779588842654 | 0.985 |
| 0.03114988390973734 | 0.986 |
| 0.3223957926390895 | 0.987 |
| 0.07869050513693508 | 0.988 |
| 0.08828173707676039 | 0.989 |
| 0.13573807214582712 | 0.99 |
| 0.2818444962251642 | 0.991 |
| 0.07055552188810513 | 0.992 |
| 0.22526420899861976 | 0.993 |
| 0.809036069677203 | 0.994 |
| 0.07556838356457841 | 0.995 |
| 0.3846916709362459 | 0.996 |
| 0.7208229710766237 | 0.997 |
| 0.11029595227621596 | 0.998 |
| 0.11529465858038489 | 0.999 |
| 0.10842696647835111 | 1 |